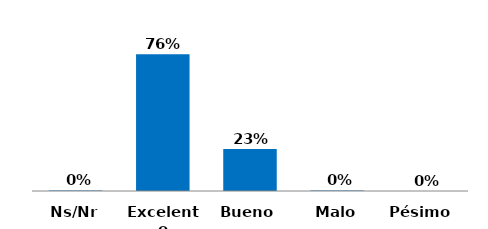
| Category | Series 0 |
|---|---|
| Pésimo  | 0 |
| Malo | 0.003 |
| Bueno | 0.233 |
| Excelente | 0.76 |
| Ns/Nr | 0.003 |